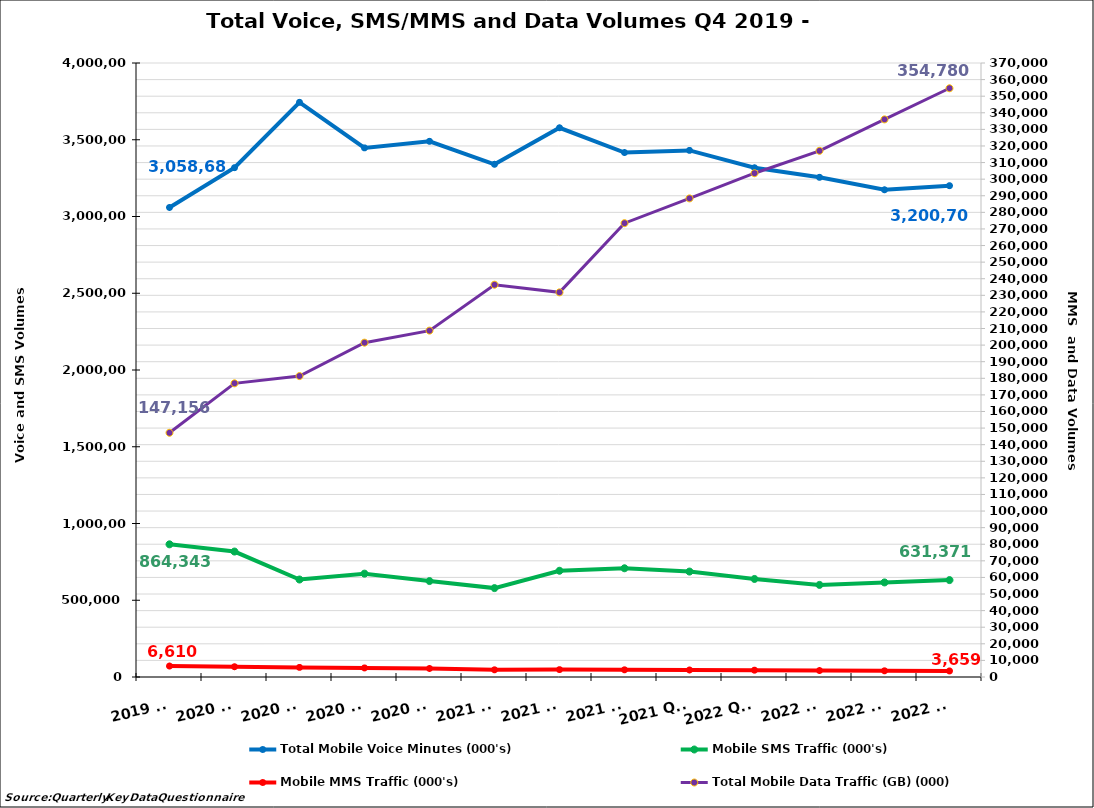
| Category | Total Mobile Voice Minutes (000's) | Mobile SMS Traffic (000's) |
|---|---|---|
| 2019 Q4 | 3058682.979 | 864343.063 |
| 2020 Q1 | 3317905.655 | 817190.979 |
| 2020 Q2 | 3743853.165 | 635067.581 |
| 2020 Q3 | 3447078.14 | 673286.691 |
| 2020 Q4 | 3489753.521 | 625059.091 |
| 2021 Q1 | 3340235.217 | 579171.791 |
| 2021 Q2 | 3578036.303 | 692076.001 |
| 2021 Q3 | 3416726.808 | 708452.242 |
| 2021 Q4  | 3430689.797 | 686812.513 |
| 2022 Q1  | 3317560.386 | 638652.61 |
| 2022 Q2 | 3255142.202 | 599959.818 |
| 2022 Q3 | 3174171.786 | 616142.922 |
| 2022 Q4 | 3200704.398 | 631371.265 |